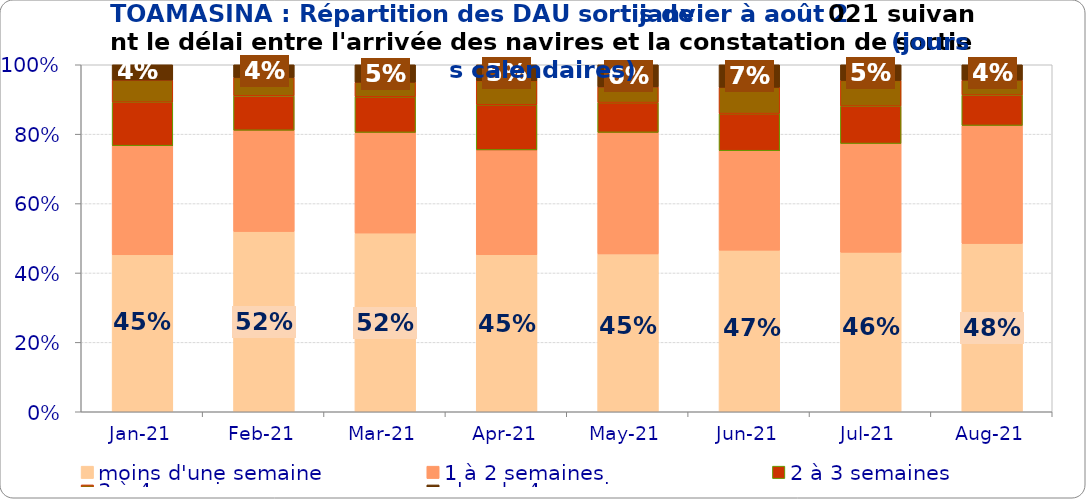
| Category | moins d'une semaine | 1 à 2 semaines | 2 à 3 semaines | 3 à 4 semaines | plus de 4 semaines |
|---|---|---|---|---|---|
| 2021-01-01 | 0.452 | 0.314 | 0.125 | 0.064 | 0.044 |
| 2021-02-01 | 0.519 | 0.292 | 0.099 | 0.053 | 0.037 |
| 2021-03-01 | 0.515 | 0.29 | 0.103 | 0.042 | 0.05 |
| 2021-04-01 | 0.452 | 0.302 | 0.13 | 0.069 | 0.046 |
| 2021-05-01 | 0.455 | 0.35 | 0.086 | 0.045 | 0.064 |
| 2021-06-01 | 0.466 | 0.287 | 0.107 | 0.076 | 0.065 |
| 2021-07-01 | 0.459 | 0.313 | 0.108 | 0.074 | 0.045 |
| 2021-08-01 | 0.485 | 0.34 | 0.088 | 0.043 | 0.044 |